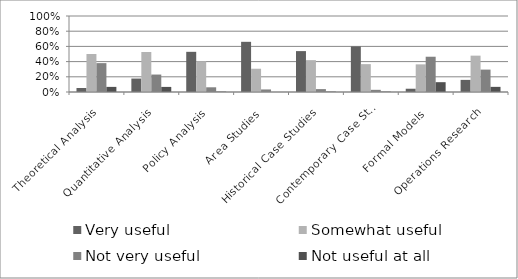
| Category | Very useful | Somewhat useful | Not very useful | Not useful at all |
|---|---|---|---|---|
| Theoretical Analysis | 0.053 | 0.5 | 0.38 | 0.067 |
| Quantitative Analysis | 0.177 | 0.526 | 0.23 | 0.067 |
| Policy Analysis | 0.529 | 0.405 | 0.062 | 0.005 |
| Area Studies | 0.66 | 0.306 | 0.033 | 0 |
| Historical Case Studies | 0.538 | 0.419 | 0.038 | 0.005 |
| Contemporary Case Studies | 0.6 | 0.367 | 0.029 | 0.005 |
| Formal Models | 0.043 | 0.364 | 0.464 | 0.129 |
| Operations Research | 0.159 | 0.478 | 0.295 | 0.068 |